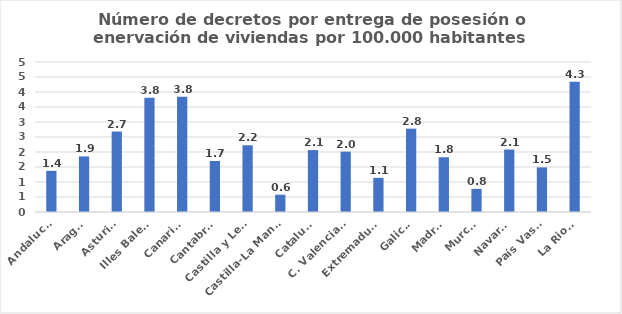
| Category | Numero de decretos por entrega de posesión o enervacion por 100.000 habitantes |
|---|---|
| Andalucía | 1.372 |
| Aragón | 1.853 |
| Asturias | 2.682 |
| Illes Balears | 3.812 |
| Canarias | 3.841 |
| Cantabria | 1.699 |
| Castilla y León | 2.224 |
| Castilla-La Mancha | 0.577 |
| Cataluña | 2.064 |
| C. Valenciana | 2.012 |
| Extremadura | 1.138 |
| Galicia | 2.778 |
| Madrid | 1.825 |
| Murcia | 0.773 |
| Navarra | 2.083 |
| País Vasco | 1.487 |
| La Rioja | 4.344 |